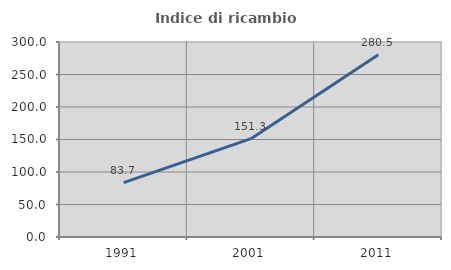
| Category | Indice di ricambio occupazionale  |
|---|---|
| 1991.0 | 83.688 |
| 2001.0 | 151.261 |
| 2011.0 | 280.531 |